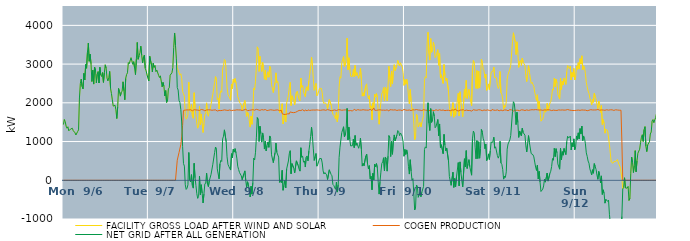
| Category | FACILITY GROSS LOAD AFTER WIND AND SOLAR | COGEN PRODUCTION | NET GRID AFTER ALL GENERATION |
|---|---|---|---|
|  Mon  9/6 | 1440 | 0 | 1440 |
|  Mon  9/6 | 1570 | 0 | 1570 |
|  Mon  9/6 | 1513 | 0 | 1513 |
|  Mon  9/6 | 1398 | 0 | 1398 |
|  Mon  9/6 | 1344 | 0 | 1344 |
|  Mon  9/6 | 1382 | 0 | 1382 |
|  Mon  9/6 | 1277 | 0 | 1277 |
|  Mon  9/6 | 1284 | 0 | 1284 |
|  Mon  9/6 | 1323 | 0 | 1323 |
|  Mon  9/6 | 1324 | 0 | 1324 |
|  Mon  9/6 | 1343 | 0 | 1343 |
|  Mon  9/6 | 1282 | 0 | 1282 |
|  Mon  9/6 | 1268 | 0 | 1268 |
|  Mon  9/6 | 1226 | 0 | 1226 |
|  Mon  9/6 | 1169 | 0 | 1169 |
|  Mon  9/6 | 1148 | 0 | 1148 |
|  Mon  9/6 | 1260 | 0 | 1260 |
|  Mon  9/6 | 1301 | 0 | 1301 |
|  Mon  9/6 | 2125 | 0 | 2125 |
|  Mon  9/6 | 2493 | 0 | 2493 |
|  Mon  9/6 | 2610 | 0 | 2610 |
|  Mon  9/6 | 2418 | 0 | 2418 |
|  Mon  9/6 | 2359 | 0 | 2359 |
|  Mon  9/6 | 2760 | 0 | 2760 |
|  Mon  9/6 | 2590 | 0 | 2590 |
|  Mon  9/6 | 2988 | 0 | 2988 |
|  Mon  9/6 | 2892 | 0 | 2892 |
|  Mon  9/6 | 3305 | 0 | 3305 |
|  Mon  9/6 | 3542 | 0 | 3542 |
|  Mon  9/6 | 3073 | 0 | 3073 |
|  Mon  9/6 | 3255 | 0 | 3255 |
|  Mon  9/6 | 3012 | 0 | 3012 |
|  Mon  9/6 | 2550 | 0 | 2550 |
|  Mon  9/6 | 2844 | 0 | 2844 |
|  Mon  9/6 | 2484 | 0 | 2484 |
|  Mon  9/6 | 2923 | 0 | 2923 |
|  Mon  9/6 | 2847 | 0 | 2847 |
|  Mon  9/6 | 2517 | 0 | 2517 |
|  Mon  9/6 | 2739 | 0 | 2739 |
|  Mon  9/6 | 2807 | 0 | 2807 |
|  Mon  9/6 | 2512 | 0 | 2512 |
|  Mon  9/6 | 2918 | 0 | 2918 |
|  Mon  9/6 | 2721 | 0 | 2721 |
|  Mon  9/6 | 2679 | 0 | 2679 |
|  Mon  9/6 | 2782 | 0 | 2782 |
|  Mon  9/6 | 2528 | 0 | 2528 |
|  Mon  9/6 | 2772 | 0 | 2772 |
|  Mon  9/6 | 2981 | 0 | 2981 |
|  Mon  9/6 | 2894 | 0 | 2894 |
|  Mon  9/6 | 2640 | 0 | 2640 |
|  Mon  9/6 | 2564 | 0 | 2564 |
|  Mon  9/6 | 2644 | 0 | 2644 |
|  Mon  9/6 | 2810 | 0 | 2810 |
|  Mon  9/6 | 2367 | 0 | 2367 |
|  Mon  9/6 | 2238 | 0 | 2238 |
|  Mon  9/6 | 2075 | 0 | 2075 |
|  Mon  9/6 | 1915 | 0 | 1915 |
|  Mon  9/6 | 1892 | 0 | 1892 |
|  Mon  9/6 | 1938 | 0 | 1938 |
|  Mon  9/6 | 1819 | 0 | 1819 |
|  Mon  9/6 | 1594 | 0 | 1594 |
|  Mon  9/6 | 1897 | 0 | 1897 |
|  Mon  9/6 | 2371 | 0 | 2371 |
|  Mon  9/6 | 2284 | 0 | 2284 |
|  Mon  9/6 | 2173 | 0 | 2173 |
|  Mon  9/6 | 2274 | 0 | 2274 |
|  Mon  9/6 | 2301 | 0 | 2301 |
|  Mon  9/6 | 2542 | 0 | 2542 |
|  Mon  9/6 | 2311 | 0 | 2311 |
|  Mon  9/6 | 2079 | 0 | 2079 |
|  Mon  9/6 | 2630 | 0 | 2630 |
|  Mon  9/6 | 2729 | 0 | 2729 |
|  Mon  9/6 | 2774 | 0 | 2774 |
|  Mon  9/6 | 3039 | 0 | 3039 |
|  Mon  9/6 | 3012 | 0 | 3012 |
|  Mon  9/6 | 3008 | 0 | 3008 |
|  Mon  9/6 | 3166 | 0 | 3166 |
|  Mon  9/6 | 3168 | 0 | 3168 |
|  Mon  9/6 | 2994 | 0 | 2994 |
|  Mon  9/6 | 3063 | 0 | 3063 |
|  Mon  9/6 | 2901 | 0 | 2901 |
|  Mon  9/6 | 2729 | 0 | 2729 |
|  Mon  9/6 | 3128 | 0 | 3128 |
|  Mon  9/6 | 3559 | 0 | 3559 |
|  Mon  9/6 | 3124 | 0 | 3124 |
|  Mon  9/6 | 3210 | 0 | 3210 |
|  Mon  9/6 | 3291 | 0 | 3291 |
|  Mon  9/6 | 3463 | 0 | 3463 |
|  Mon  9/6 | 3228 | 0 | 3228 |
|  Mon  9/6 | 3028 | 0 | 3028 |
|  Mon  9/6 | 3182 | 0 | 3182 |
|  Mon  9/6 | 3233 | 0 | 3233 |
|  Mon  9/6 | 2890 | 0 | 2890 |
|  Mon  9/6 | 2823 | 0 | 2823 |
|  Mon  9/6 | 2720 | 0 | 2720 |
|  Mon  9/6 | 2702 | 0 | 2702 |
|  Tue  9/7 | 2564 | 0 | 2564 |
|  Tue  9/7 | 3204 | 0 | 3204 |
|  Tue  9/7 | 3201 | 0 | 3201 |
|  Tue  9/7 | 2976 | 0 | 2976 |
|  Tue  9/7 | 2799 | 0 | 2799 |
|  Tue  9/7 | 3021 | 0 | 3021 |
|  Tue  9/7 | 2916 | 0 | 2916 |
|  Tue  9/7 | 2964 | 0 | 2964 |
|  Tue  9/7 | 2805 | 0 | 2805 |
|  Tue  9/7 | 2845 | 0 | 2845 |
|  Tue  9/7 | 2868 | 0 | 2868 |
|  Tue  9/7 | 2711 | 0 | 2711 |
|  Tue  9/7 | 2653 | 0 | 2653 |
|  Tue  9/7 | 2697 | 0 | 2697 |
|  Tue  9/7 | 2678 | 0 | 2678 |
|  Tue  9/7 | 2414 | 0 | 2414 |
|  Tue  9/7 | 2527 | 0 | 2527 |
|  Tue  9/7 | 2426 | 0 | 2426 |
|  Tue  9/7 | 2176 | 0 | 2176 |
|  Tue  9/7 | 2316 | 0 | 2316 |
|  Tue  9/7 | 2009 | 0 | 2009 |
|  Tue  9/7 | 2038 | 0 | 2038 |
|  Tue  9/7 | 2361 | 0 | 2361 |
|  Tue  9/7 | 2387 | 0 | 2387 |
|  Tue  9/7 | 2712 | 0 | 2712 |
|  Tue  9/7 | 2733 | 0 | 2733 |
|  Tue  9/7 | 2776 | 0 | 2776 |
|  Tue  9/7 | 2906 | 0 | 2906 |
|  Tue  9/7 | 3433 | 0 | 3433 |
|  Tue  9/7 | 3803 | 0 | 3803 |
|  Tue  9/7 | 3480 | 0 | 3480 |
|  Tue  9/7 | 3134 | 0 | 3134 |
|  Tue  9/7 | 2912 | 518 | 2394 |
|  Tue  9/7 | 2839 | 510 | 2329 |
|  Tue  9/7 | 2776 | 718 | 2058 |
|  Tue  9/7 | 2716 | 709 | 2007 |
|  Tue  9/7 | 2751 | 921 | 1830 |
|  Tue  9/7 | 2625 | 1120 | 1505 |
|  Tue  9/7 | 2293 | 1417 | 876 |
|  Tue  9/7 | 2235 | 1804 | 431 |
|  Tue  9/7 | 2169 | 1803 | 366 |
|  Tue  9/7 | 1695 | 1812 | -117 |
|  Tue  9/7 | 1578 | 1814 | -236 |
|  Tue  9/7 | 1613 | 1817 | -204 |
|  Tue  9/7 | 1697 | 1814 | -117 |
|  Tue  9/7 | 2532 | 1815 | 717 |
|  Tue  9/7 | 1827 | 1818 | 9 |
|  Tue  9/7 | 1777 | 1821 | -44 |
|  Tue  9/7 | 1957 | 1811 | 146 |
|  Tue  9/7 | 1659 | 1795 | -136 |
|  Tue  9/7 | 1600 | 1803 | -203 |
|  Tue  9/7 | 2261 | 1823 | 438 |
|  Tue  9/7 | 1878 | 1814 | 64 |
|  Tue  9/7 | 1681 | 1816 | -135 |
|  Tue  9/7 | 1465 | 1812 | -347 |
|  Tue  9/7 | 1344 | 1812 | -468 |
|  Tue  9/7 | 1399 | 1814 | -415 |
|  Tue  9/7 | 1912 | 1803 | 109 |
|  Tue  9/7 | 1440 | 1812 | -372 |
|  Tue  9/7 | 1712 | 1827 | -115 |
|  Tue  9/7 | 1472 | 1804 | -332 |
|  Tue  9/7 | 1234 | 1819 | -585 |
|  Tue  9/7 | 1461 | 1817 | -356 |
|  Tue  9/7 | 1697 | 1794 | -97 |
|  Tue  9/7 | 1748 | 1819 | -71 |
|  Tue  9/7 | 1999 | 1815 | 184 |
|  Tue  9/7 | 1708 | 1812 | -104 |
|  Tue  9/7 | 1653 | 1819 | -166 |
|  Tue  9/7 | 1794 | 1809 | -15 |
|  Tue  9/7 | 1825 | 1817 | 8 |
|  Tue  9/7 | 1958 | 1806 | 152 |
|  Tue  9/7 | 1936 | 1808 | 128 |
|  Tue  9/7 | 2223 | 1809 | 414 |
|  Tue  9/7 | 2246 | 1814 | 432 |
|  Tue  9/7 | 2529 | 1815 | 714 |
|  Tue  9/7 | 2676 | 1817 | 859 |
|  Tue  9/7 | 2597 | 1807 | 790 |
|  Tue  9/7 | 2083 | 1788 | 295 |
|  Tue  9/7 | 2126 | 1808 | 318 |
|  Tue  9/7 | 1839 | 1802 | 37 |
|  Tue  9/7 | 2217 | 1795 | 422 |
|  Tue  9/7 | 2312 | 1799 | 513 |
|  Tue  9/7 | 2271 | 1786 | 485 |
|  Tue  9/7 | 2873 | 1806 | 1067 |
|  Tue  9/7 | 2959 | 1821 | 1138 |
|  Tue  9/7 | 3120 | 1818 | 1302 |
|  Tue  9/7 | 3094 | 1807 | 1287 |
|  Tue  9/7 | 2805 | 1809 | 996 |
|  Tue  9/7 | 2408 | 1803 | 605 |
|  Tue  9/7 | 2216 | 1803 | 413 |
|  Tue  9/7 | 2172 | 1815 | 357 |
|  Tue  9/7 | 2149 | 1815 | 334 |
|  Tue  9/7 | 2067 | 1803 | 264 |
|  Tue  9/7 | 2486 | 1799 | 687 |
|  Tue  9/7 | 2363 | 1787 | 576 |
|  Tue  9/7 | 2609 | 1808 | 801 |
|  Wed  9/8 | 2529 | 1802 | 727 |
|  Wed  9/8 | 2627 | 1809 | 818 |
|  Wed  9/8 | 2517 | 1810 | 707 |
|  Wed  9/8 | 2391 | 1819 | 572 |
|  Wed  9/8 | 2163 | 1799 | 364 |
|  Wed  9/8 | 2093 | 1815 | 278 |
|  Wed  9/8 | 2016 | 1815 | 201 |
|  Wed  9/8 | 2016 | 1815 | 201 |
|  Wed  9/8 | 1940 | 1826 | 114 |
|  Wed  9/8 | 1814 | 1801 | 13 |
|  Wed  9/8 | 1818 | 1803 | 15 |
|  Wed  9/8 | 1991 | 1816 | 175 |
|  Wed  9/8 | 2061 | 1818 | 243 |
|  Wed  9/8 | 1833 | 1832 | 1 |
|  Wed  9/8 | 1649 | 1833 | -184 |
|  Wed  9/8 | 1760 | 1798 | -38 |
|  Wed  9/8 | 1690 | 1805 | -115 |
|  Wed  9/8 | 1689 | 1806 | -117 |
|  Wed  9/8 | 1373 | 1805 | -432 |
|  Wed  9/8 | 1659 | 1813 | -154 |
|  Wed  9/8 | 1445 | 1804 | -359 |
|  Wed  9/8 | 1765 | 1823 | -58 |
|  Wed  9/8 | 2381 | 1813 | 568 |
|  Wed  9/8 | 2334 | 1810 | 524 |
|  Wed  9/8 | 2557 | 1833 | 724 |
|  Wed  9/8 | 2946 | 1832 | 1114 |
|  Wed  9/8 | 3445 | 1827 | 1618 |
|  Wed  9/8 | 3387 | 1818 | 1569 |
|  Wed  9/8 | 2810 | 1809 | 1001 |
|  Wed  9/8 | 3200 | 1805 | 1395 |
|  Wed  9/8 | 3004 | 1802 | 1202 |
|  Wed  9/8 | 2809 | 1824 | 985 |
|  Wed  9/8 | 3044 | 1822 | 1222 |
|  Wed  9/8 | 2915 | 1815 | 1100 |
|  Wed  9/8 | 2609 | 1803 | 806 |
|  Wed  9/8 | 2840 | 1826 | 1014 |
|  Wed  9/8 | 2588 | 1827 | 761 |
|  Wed  9/8 | 2696 | 1800 | 896 |
|  Wed  9/8 | 2801 | 1811 | 990 |
|  Wed  9/8 | 2661 | 1810 | 851 |
|  Wed  9/8 | 2946 | 1802 | 1144 |
|  Wed  9/8 | 2900 | 1820 | 1080 |
|  Wed  9/8 | 2468 | 1810 | 658 |
|  Wed  9/8 | 2476 | 1813 | 663 |
|  Wed  9/8 | 2265 | 1810 | 455 |
|  Wed  9/8 | 2244 | 1806 | 438 |
|  Wed  9/8 | 2526 | 1810 | 716 |
|  Wed  9/8 | 2774 | 1814 | 960 |
|  Wed  9/8 | 2521 | 1802 | 719 |
|  Wed  9/8 | 2554 | 1817 | 737 |
|  Wed  9/8 | 2411 | 1813 | 598 |
|  Wed  9/8 | 1743 | 1797 | -54 |
|  Wed  9/8 | 1822 | 1813 | 9 |
|  Wed  9/8 | 1746 | 1808 | -62 |
|  Wed  9/8 | 1976 | 1719 | 257 |
|  Wed  9/8 | 1457 | 1715 | -258 |
|  Wed  9/8 | 1564 | 1700 | -136 |
|  Wed  9/8 | 1713 | 1716 | -3 |
|  Wed  9/8 | 1507 | 1701 | -194 |
|  Wed  9/8 | 1996 | 1705 | 291 |
|  Wed  9/8 | 2006 | 1716 | 290 |
|  Wed  9/8 | 2196 | 1698 | 498 |
|  Wed  9/8 | 2404 | 1716 | 688 |
|  Wed  9/8 | 2529 | 1765 | 764 |
|  Wed  9/8 | 1931 | 1763 | 168 |
|  Wed  9/8 | 2182 | 1751 | 431 |
|  Wed  9/8 | 2192 | 1764 | 428 |
|  Wed  9/8 | 2058 | 1746 | 312 |
|  Wed  9/8 | 1946 | 1757 | 189 |
|  Wed  9/8 | 1953 | 1755 | 198 |
|  Wed  9/8 | 2273 | 1771 | 502 |
|  Wed  9/8 | 2302 | 1779 | 523 |
|  Wed  9/8 | 2176 | 1798 | 378 |
|  Wed  9/8 | 2092 | 1804 | 288 |
|  Wed  9/8 | 2050 | 1814 | 236 |
|  Wed  9/8 | 2641 | 1801 | 840 |
|  Wed  9/8 | 2398 | 1805 | 593 |
|  Wed  9/8 | 2444 | 1823 | 621 |
|  Wed  9/8 | 2278 | 1812 | 466 |
|  Wed  9/8 | 2286 | 1787 | 499 |
|  Wed  9/8 | 2159 | 1817 | 342 |
|  Wed  9/8 | 2385 | 1792 | 593 |
|  Wed  9/8 | 2420 | 1792 | 628 |
|  Wed  9/8 | 2319 | 1818 | 501 |
|  Wed  9/8 | 2566 | 1812 | 754 |
|  Wed  9/8 | 2732 | 1803 | 929 |
|  Wed  9/8 | 2944 | 1809 | 1135 |
|  Wed  9/8 | 3180 | 1811 | 1369 |
|  Wed  9/8 | 2947 | 1818 | 1129 |
|  Wed  9/8 | 2624 | 1814 | 810 |
|  Wed  9/8 | 2324 | 1812 | 512 |
|  Wed  9/8 | 2424 | 1812 | 612 |
|  Wed  9/8 | 2501 | 1810 | 691 |
|  Wed  9/8 | 2181 | 1817 | 364 |
|  Wed  9/8 | 2214 | 1806 | 408 |
|  Wed  9/8 | 2225 | 1811 | 414 |
|  Thu  9/9 | 2375 | 1815 | 560 |
|  Thu  9/9 | 2370 | 1806 | 564 |
|  Thu  9/9 | 2370 | 1809 | 561 |
|  Thu  9/9 | 2263 | 1815 | 448 |
|  Thu  9/9 | 2040 | 1797 | 243 |
|  Thu  9/9 | 1979 | 1818 | 161 |
|  Thu  9/9 | 2007 | 1807 | 200 |
|  Thu  9/9 | 1995 | 1806 | 189 |
|  Thu  9/9 | 1957 | 1817 | 140 |
|  Thu  9/9 | 1844 | 1825 | 19 |
|  Thu  9/9 | 1839 | 1812 | 27 |
|  Thu  9/9 | 2084 | 1813 | 271 |
|  Thu  9/9 | 2070 | 1818 | 252 |
|  Thu  9/9 | 1944 | 1793 | 151 |
|  Thu  9/9 | 1929 | 1815 | 114 |
|  Thu  9/9 | 1700 | 1806 | -106 |
|  Thu  9/9 | 1686 | 1819 | -133 |
|  Thu  9/9 | 1659 | 1816 | -157 |
|  Thu  9/9 | 1581 | 1815 | -234 |
|  Thu  9/9 | 1754 | 1800 | -46 |
|  Thu  9/9 | 1507 | 1812 | -305 |
|  Thu  9/9 | 1696 | 1820 | -124 |
|  Thu  9/9 | 2392 | 1804 | 588 |
|  Thu  9/9 | 2673 | 1819 | 854 |
|  Thu  9/9 | 2637 | 1802 | 835 |
|  Thu  9/9 | 3039 | 1807 | 1232 |
|  Thu  9/9 | 3019 | 1807 | 1212 |
|  Thu  9/9 | 3196 | 1814 | 1382 |
|  Thu  9/9 | 2935 | 1813 | 1122 |
|  Thu  9/9 | 2976 | 1818 | 1158 |
|  Thu  9/9 | 3152 | 1808 | 1344 |
|  Thu  9/9 | 3671 | 1815 | 1856 |
|  Thu  9/9 | 2854 | 1810 | 1044 |
|  Thu  9/9 | 3164 | 1793 | 1371 |
|  Thu  9/9 | 2872 | 1814 | 1058 |
|  Thu  9/9 | 2687 | 1801 | 886 |
|  Thu  9/9 | 2672 | 1807 | 865 |
|  Thu  9/9 | 2681 | 1787 | 894 |
|  Thu  9/9 | 2861 | 1799 | 1062 |
|  Thu  9/9 | 2677 | 1834 | 843 |
|  Thu  9/9 | 2965 | 1809 | 1156 |
|  Thu  9/9 | 2705 | 1803 | 902 |
|  Thu  9/9 | 2779 | 1819 | 960 |
|  Thu  9/9 | 2788 | 1824 | 964 |
|  Thu  9/9 | 2632 | 1806 | 826 |
|  Thu  9/9 | 2726 | 1813 | 913 |
|  Thu  9/9 | 2897 | 1810 | 1087 |
|  Thu  9/9 | 2621 | 1812 | 809 |
|  Thu  9/9 | 2172 | 1806 | 366 |
|  Thu  9/9 | 2260 | 1822 | 438 |
|  Thu  9/9 | 2174 | 1802 | 372 |
|  Thu  9/9 | 2176 | 1814 | 362 |
|  Thu  9/9 | 2443 | 1819 | 624 |
|  Thu  9/9 | 2490 | 1812 | 678 |
|  Thu  9/9 | 2213 | 1795 | 418 |
|  Thu  9/9 | 2100 | 1810 | 290 |
|  Thu  9/9 | 2184 | 1806 | 378 |
|  Thu  9/9 | 1871 | 1831 | 40 |
|  Thu  9/9 | 1921 | 1820 | 101 |
|  Thu  9/9 | 1556 | 1801 | -245 |
|  Thu  9/9 | 2001 | 1821 | 180 |
|  Thu  9/9 | 1878 | 1868 | 10 |
|  Thu  9/9 | 2224 | 1809 | 415 |
|  Thu  9/9 | 2156 | 1811 | 345 |
|  Thu  9/9 | 2239 | 1806 | 433 |
|  Thu  9/9 | 2132 | 1811 | 321 |
|  Thu  9/9 | 1765 | 1815 | -50 |
|  Thu  9/9 | 1447 | 1804 | -357 |
|  Thu  9/9 | 1788 | 1819 | -31 |
|  Thu  9/9 | 2013 | 1803 | 210 |
|  Thu  9/9 | 2243 | 1811 | 432 |
|  Thu  9/9 | 2278 | 1802 | 476 |
|  Thu  9/9 | 2392 | 1811 | 581 |
|  Thu  9/9 | 2055 | 1810 | 245 |
|  Thu  9/9 | 2408 | 1807 | 601 |
|  Thu  9/9 | 2365 | 1818 | 547 |
|  Thu  9/9 | 2053 | 1818 | 235 |
|  Thu  9/9 | 2419 | 1797 | 622 |
|  Thu  9/9 | 2942 | 1788 | 1154 |
|  Thu  9/9 | 2919 | 1822 | 1097 |
|  Thu  9/9 | 2422 | 1810 | 612 |
|  Thu  9/9 | 2822 | 1819 | 1003 |
|  Thu  9/9 | 2485 | 1814 | 671 |
|  Thu  9/9 | 2839 | 1814 | 1025 |
|  Thu  9/9 | 2985 | 1814 | 1171 |
|  Thu  9/9 | 2834 | 1819 | 1015 |
|  Thu  9/9 | 2811 | 1801 | 1010 |
|  Thu  9/9 | 2970 | 1803 | 1167 |
|  Thu  9/9 | 3094 | 1810 | 1284 |
|  Thu  9/9 | 3070 | 1813 | 1257 |
|  Thu  9/9 | 2952 | 1800 | 1152 |
|  Thu  9/9 | 3034 | 1813 | 1221 |
|  Thu  9/9 | 2977 | 1793 | 1184 |
|  Thu  9/9 | 2925 | 1801 | 1124 |
|  Thu  9/9 | 2781 | 1790 | 991 |
|  Thu  9/9 | 2450 | 1830 | 620 |
|  Fri  9/10 | 2602 | 1806 | 796 |
|  Fri  9/10 | 2479 | 1812 | 667 |
|  Fri  9/10 | 2608 | 1824 | 784 |
|  Fri  9/10 | 2477 | 1808 | 669 |
|  Fri  9/10 | 2170 | 1811 | 359 |
|  Fri  9/10 | 1974 | 1814 | 160 |
|  Fri  9/10 | 2344 | 1814 | 530 |
|  Fri  9/10 | 2030 | 1799 | 231 |
|  Fri  9/10 | 1818 | 1816 | 2 |
|  Fri  9/10 | 1862 | 1819 | 43 |
|  Fri  9/10 | 1467 | 1812 | -345 |
|  Fri  9/10 | 1049 | 1816 | -767 |
|  Fri  9/10 | 1118 | 1808 | -690 |
|  Fri  9/10 | 1704 | 1826 | -122 |
|  Fri  9/10 | 1652 | 1804 | -152 |
|  Fri  9/10 | 1375 | 1814 | -439 |
|  Fri  9/10 | 1431 | 1808 | -377 |
|  Fri  9/10 | 1494 | 1811 | -317 |
|  Fri  9/10 | 1376 | 1802 | -426 |
|  Fri  9/10 | 1490 | 1801 | -311 |
|  Fri  9/10 | 1480 | 1811 | -331 |
|  Fri  9/10 | 1666 | 1823 | -157 |
|  Fri  9/10 | 2597 | 1801 | 796 |
|  Fri  9/10 | 2675 | 1812 | 863 |
|  Fri  9/10 | 2646 | 1814 | 832 |
|  Fri  9/10 | 3544 | 1806 | 1738 |
|  Fri  9/10 | 3821 | 1820 | 2001 |
|  Fri  9/10 | 3271 | 1799 | 1472 |
|  Fri  9/10 | 3104 | 1819 | 1285 |
|  Fri  9/10 | 3660 | 1810 | 1850 |
|  Fri  9/10 | 3305 | 1810 | 1495 |
|  Fri  9/10 | 3365 | 1807 | 1558 |
|  Fri  9/10 | 3563 | 1792 | 1771 |
|  Fri  9/10 | 3456 | 1798 | 1658 |
|  Fri  9/10 | 3167 | 1810 | 1357 |
|  Fri  9/10 | 3209 | 1821 | 1388 |
|  Fri  9/10 | 3218 | 1820 | 1398 |
|  Fri  9/10 | 3373 | 1803 | 1570 |
|  Fri  9/10 | 2969 | 1820 | 1149 |
|  Fri  9/10 | 3274 | 1820 | 1454 |
|  Fri  9/10 | 2647 | 1801 | 846 |
|  Fri  9/10 | 2724 | 1806 | 918 |
|  Fri  9/10 | 2739 | 1814 | 925 |
|  Fri  9/10 | 2501 | 1814 | 687 |
|  Fri  9/10 | 2989 | 1804 | 1185 |
|  Fri  9/10 | 2705 | 1798 | 907 |
|  Fri  9/10 | 2574 | 1816 | 758 |
|  Fri  9/10 | 2640 | 1806 | 834 |
|  Fri  9/10 | 2628 | 1804 | 824 |
|  Fri  9/10 | 2312 | 1807 | 505 |
|  Fri  9/10 | 1899 | 1801 | 98 |
|  Fri  9/10 | 1890 | 1795 | 95 |
|  Fri  9/10 | 1655 | 1785 | -130 |
|  Fri  9/10 | 1679 | 1816 | -137 |
|  Fri  9/10 | 2003 | 1796 | 207 |
|  Fri  9/10 | 1627 | 1812 | -185 |
|  Fri  9/10 | 1848 | 1803 | 45 |
|  Fri  9/10 | 1673 | 1839 | -166 |
|  Fri  9/10 | 1889 | 1804 | 85 |
|  Fri  9/10 | 1888 | 1828 | 60 |
|  Fri  9/10 | 2246 | 1789 | 457 |
|  Fri  9/10 | 1660 | 1804 | -144 |
|  Fri  9/10 | 2287 | 1812 | 475 |
|  Fri  9/10 | 2021 | 1817 | 204 |
|  Fri  9/10 | 1811 | 1815 | -4 |
|  Fri  9/10 | 1640 | 1811 | -171 |
|  Fri  9/10 | 1664 | 1822 | -158 |
|  Fri  9/10 | 2352 | 1796 | 556 |
|  Fri  9/10 | 2144 | 1800 | 344 |
|  Fri  9/10 | 2579 | 1813 | 766 |
|  Fri  9/10 | 2112 | 1807 | 305 |
|  Fri  9/10 | 2227 | 1802 | 425 |
|  Fri  9/10 | 2346 | 1813 | 533 |
|  Fri  9/10 | 2151 | 1803 | 348 |
|  Fri  9/10 | 2165 | 1820 | 345 |
|  Fri  9/10 | 1918 | 1787 | 131 |
|  Fri  9/10 | 2892 | 1811 | 1081 |
|  Fri  9/10 | 3093 | 1822 | 1271 |
|  Fri  9/10 | 3028 | 1809 | 1219 |
|  Fri  9/10 | 2666 | 1811 | 855 |
|  Fri  9/10 | 2372 | 1819 | 553 |
|  Fri  9/10 | 2831 | 1808 | 1023 |
|  Fri  9/10 | 2370 | 1809 | 561 |
|  Fri  9/10 | 2817 | 1822 | 995 |
|  Fri  9/10 | 2385 | 1815 | 570 |
|  Fri  9/10 | 2632 | 1816 | 816 |
|  Fri  9/10 | 3125 | 1812 | 1313 |
|  Fri  9/10 | 3043 | 1797 | 1246 |
|  Fri  9/10 | 2869 | 1783 | 1086 |
|  Fri  9/10 | 2827 | 1815 | 1012 |
|  Fri  9/10 | 2640 | 1825 | 815 |
|  Fri  9/10 | 2738 | 1806 | 932 |
|  Fri  9/10 | 2322 | 1812 | 510 |
|  Fri  9/10 | 2390 | 1817 | 573 |
|  Fri  9/10 | 2488 | 1806 | 682 |
|  Fri  9/10 | 2341 | 1804 | 537 |
|  Sat  9/11 | 2582 | 1822 | 760 |
|  Sat  9/11 | 2789 | 1793 | 996 |
|  Sat  9/11 | 2796 | 1828 | 968 |
|  Sat  9/11 | 2822 | 1811 | 1011 |
|  Sat  9/11 | 2921 | 1810 | 1111 |
|  Sat  9/11 | 2654 | 1825 | 829 |
|  Sat  9/11 | 2670 | 1806 | 864 |
|  Sat  9/11 | 2643 | 1800 | 843 |
|  Sat  9/11 | 2457 | 1818 | 639 |
|  Sat  9/11 | 2371 | 1800 | 571 |
|  Sat  9/11 | 2427 | 1794 | 633 |
|  Sat  9/11 | 2809 | 1803 | 1006 |
|  Sat  9/11 | 2260 | 1813 | 447 |
|  Sat  9/11 | 2223 | 1812 | 411 |
|  Sat  9/11 | 2078 | 1797 | 281 |
|  Sat  9/11 | 1833 | 1803 | 30 |
|  Sat  9/11 | 1926 | 1816 | 110 |
|  Sat  9/11 | 1889 | 1816 | 73 |
|  Sat  9/11 | 2032 | 1814 | 218 |
|  Sat  9/11 | 2613 | 1809 | 804 |
|  Sat  9/11 | 2732 | 1795 | 937 |
|  Sat  9/11 | 2723 | 1795 | 928 |
|  Sat  9/11 | 2866 | 1824 | 1042 |
|  Sat  9/11 | 2966 | 1811 | 1155 |
|  Sat  9/11 | 2958 | 1816 | 1142 |
|  Sat  9/11 | 3580 | 1805 | 1775 |
|  Sat  9/11 | 3808 | 1780 | 2028 |
|  Sat  9/11 | 3797 | 1810 | 1987 |
|  Sat  9/11 | 3572 | 1807 | 1765 |
|  Sat  9/11 | 3245 | 1808 | 1437 |
|  Sat  9/11 | 3576 | 1820 | 1756 |
|  Sat  9/11 | 3299 | 1809 | 1490 |
|  Sat  9/11 | 2915 | 1808 | 1107 |
|  Sat  9/11 | 3070 | 1797 | 1273 |
|  Sat  9/11 | 3102 | 1814 | 1288 |
|  Sat  9/11 | 2965 | 1819 | 1146 |
|  Sat  9/11 | 3155 | 1811 | 1344 |
|  Sat  9/11 | 3045 | 1815 | 1230 |
|  Sat  9/11 | 3034 | 1818 | 1216 |
|  Sat  9/11 | 2967 | 1801 | 1166 |
|  Sat  9/11 | 2699 | 1812 | 887 |
|  Sat  9/11 | 2549 | 1817 | 732 |
|  Sat  9/11 | 2760 | 1812 | 948 |
|  Sat  9/11 | 2959 | 1805 | 1154 |
|  Sat  9/11 | 2791 | 1819 | 972 |
|  Sat  9/11 | 2785 | 1815 | 970 |
|  Sat  9/11 | 2502 | 1812 | 690 |
|  Sat  9/11 | 2531 | 1822 | 709 |
|  Sat  9/11 | 2474 | 1814 | 660 |
|  Sat  9/11 | 2422 | 1818 | 604 |
|  Sat  9/11 | 2277 | 1807 | 470 |
|  Sat  9/11 | 2166 | 1825 | 341 |
|  Sat  9/11 | 2060 | 1806 | 254 |
|  Sat  9/11 | 2207 | 1819 | 388 |
|  Sat  9/11 | 1843 | 1809 | 34 |
|  Sat  9/11 | 2043 | 1813 | 230 |
|  Sat  9/11 | 1758 | 1808 | -50 |
|  Sat  9/11 | 1526 | 1816 | -290 |
|  Sat  9/11 | 1533 | 1809 | -276 |
|  Sat  9/11 | 1578 | 1807 | -229 |
|  Sat  9/11 | 1652 | 1799 | -147 |
|  Sat  9/11 | 1845 | 1816 | 29 |
|  Sat  9/11 | 1759 | 1807 | -48 |
|  Sat  9/11 | 1786 | 1814 | -28 |
|  Sat  9/11 | 1988 | 1801 | 187 |
|  Sat  9/11 | 1799 | 1821 | -22 |
|  Sat  9/11 | 1804 | 1807 | -3 |
|  Sat  9/11 | 1993 | 1816 | 177 |
|  Sat  9/11 | 2030 | 1797 | 233 |
|  Sat  9/11 | 2155 | 1799 | 356 |
|  Sat  9/11 | 2356 | 1794 | 562 |
|  Sat  9/11 | 2327 | 1811 | 516 |
|  Sat  9/11 | 2640 | 1815 | 825 |
|  Sat  9/11 | 2416 | 1805 | 611 |
|  Sat  9/11 | 2614 | 1798 | 816 |
|  Sat  9/11 | 2514 | 1803 | 711 |
|  Sat  9/11 | 2226 | 1804 | 422 |
|  Sat  9/11 | 2215 | 1817 | 398 |
|  Sat  9/11 | 2096 | 1810 | 286 |
|  Sat  9/11 | 2640 | 1812 | 828 |
|  Sat  9/11 | 2343 | 1814 | 529 |
|  Sat  9/11 | 2556 | 1816 | 740 |
|  Sat  9/11 | 2461 | 1813 | 648 |
|  Sat  9/11 | 2632 | 1811 | 821 |
|  Sat  9/11 | 2548 | 1821 | 727 |
|  Sat  9/11 | 2475 | 1813 | 662 |
|  Sat  9/11 | 2800 | 1808 | 992 |
|  Sat  9/11 | 2963 | 1827 | 1136 |
|  Sat  9/11 | 2919 | 1830 | 1089 |
|  Sat  9/11 | 2881 | 1813 | 1068 |
|  Sat  9/11 | 2945 | 1804 | 1141 |
|  Sat  9/11 | 2589 | 1806 | 783 |
|  Sat  9/11 | 2783 | 1815 | 968 |
|  Sat  9/11 | 2665 | 1801 | 864 |
|  Sat  9/11 | 2887 | 1818 | 1069 |
|  Sat  9/11 | 2589 | 1801 | 788 |
|  Sun  9/12 | 2661 | 1799 | 862 |
|  Sun  9/12 | 2951 | 1807 | 1144 |
|  Sun  9/12 | 2863 | 1809 | 1054 |
|  Sun  9/12 | 3037 | 1812 | 1225 |
|  Sun  9/12 | 2872 | 1806 | 1066 |
|  Sun  9/12 | 3140 | 1805 | 1335 |
|  Sun  9/12 | 3001 | 1802 | 1199 |
|  Sun  9/12 | 3214 | 1816 | 1398 |
|  Sun  9/12 | 2851 | 1827 | 1024 |
|  Sun  9/12 | 2957 | 1812 | 1145 |
|  Sun  9/12 | 2919 | 1833 | 1086 |
|  Sun  9/12 | 2752 | 1811 | 941 |
|  Sun  9/12 | 2530 | 1822 | 708 |
|  Sun  9/12 | 2413 | 1796 | 617 |
|  Sun  9/12 | 2305 | 1808 | 497 |
|  Sun  9/12 | 2248 | 1808 | 440 |
|  Sun  9/12 | 2124 | 1830 | 294 |
|  Sun  9/12 | 2041 | 1823 | 218 |
|  Sun  9/12 | 1943 | 1804 | 139 |
|  Sun  9/12 | 2087 | 1815 | 272 |
|  Sun  9/12 | 2013 | 1831 | 182 |
|  Sun  9/12 | 2245 | 1815 | 430 |
|  Sun  9/12 | 2162 | 1807 | 355 |
|  Sun  9/12 | 2094 | 1816 | 278 |
|  Sun  9/12 | 1950 | 1814 | 136 |
|  Sun  9/12 | 1853 | 1828 | 25 |
|  Sun  9/12 | 2045 | 1817 | 228 |
|  Sun  9/12 | 1944 | 1809 | 135 |
|  Sun  9/12 | 1755 | 1823 | -68 |
|  Sun  9/12 | 1929 | 1816 | 113 |
|  Sun  9/12 | 1440 | 1806 | -366 |
|  Sun  9/12 | 1567 | 1813 | -246 |
|  Sun  9/12 | 1469 | 1810 | -341 |
|  Sun  9/12 | 1216 | 1807 | -591 |
|  Sun  9/12 | 1320 | 1812 | -492 |
|  Sun  9/12 | 1345 | 1821 | -476 |
|  Sun  9/12 | 1273 | 1818 | -545 |
|  Sun  9/12 | 1297 | 1810 | -513 |
|  Sun  9/12 | 923 | 1801 | -878 |
|  Sun  9/12 | 921 | 1819 | -898 |
|  Sun  9/12 | 473 | 1812 | -1339 |
|  Sun  9/12 | 489 | 1819 | -1330 |
|  Sun  9/12 | 440 | 1817 | -1377 |
|  Sun  9/12 | 484 | 1804 | -1320 |
|  Sun  9/12 | 501 | 1814 | -1313 |
|  Sun  9/12 | 485 | 1820 | -1335 |
|  Sun  9/12 | 466 | 1805 | -1339 |
|  Sun  9/12 | 536 | 1814 | -1278 |
|  Sun  9/12 | 450 | 1810 | -1360 |
|  Sun  9/12 | 433 | 1809 | -1376 |
|  Sun  9/12 | 352 | 1819 | -1467 |
|  Sun  9/12 | 216 | 1808 | -1592 |
|  Sun  9/12 | 53 | 987 | -934 |
|  Sun  9/12 | -223 | 0 | -223 |
|  Sun  9/12 | -186 | 0 | -186 |
|  Sun  9/12 | 65 | 0 | 65 |
|  Sun  9/12 | -199 | 0 | -199 |
|  Sun  9/12 | -188 | 0 | -188 |
|  Sun  9/12 | -203 | 0 | -203 |
|  Sun  9/12 | -158 | 0 | -158 |
|  Sun  9/12 | -521 | 0 | -521 |
|  Sun  9/12 | -464 | 0 | -464 |
|  Sun  9/12 | 182 | 0 | 182 |
|  Sun  9/12 | 598 | 0 | 598 |
|  Sun  9/12 | 458 | 0 | 458 |
|  Sun  9/12 | 200 | 0 | 200 |
|  Sun  9/12 | 384 | 0 | 384 |
|  Sun  9/12 | 765 | 0 | 765 |
|  Sun  9/12 | 219 | 0 | 219 |
|  Sun  9/12 | 502 | 0 | 502 |
|  Sun  9/12 | 698 | 0 | 698 |
|  Sun  9/12 | 700 | 0 | 700 |
|  Sun  9/12 | 802 | 0 | 802 |
|  Sun  9/12 | 969 | 0 | 969 |
|  Sun  9/12 | 1113 | 0 | 1113 |
|  Sun  9/12 | 1175 | 0 | 1175 |
|  Sun  9/12 | 1005 | 0 | 1005 |
|  Sun  9/12 | 1306 | 0 | 1306 |
|  Sun  9/12 | 1385 | 0 | 1385 |
|  Sun  9/12 | 878 | 0 | 878 |
|  Sun  9/12 | 741 | 0 | 741 |
|  Sun  9/12 | 912 | 0 | 912 |
|  Sun  9/12 | 927 | 0 | 927 |
|  Sun  9/12 | 994 | 0 | 994 |
|  Sun  9/12 | 1195 | 0 | 1195 |
|  Sun  9/12 | 1247 | 0 | 1247 |
|  Sun  9/12 | 1531 | 0 | 1531 |
|  Sun  9/12 | 1567 | 0 | 1567 |
|  Sun  9/12 | 1486 | 0 | 1486 |
|  Sun  9/12 | 1563 | 0 | 1563 |
|  Sun  9/12 | 1616 | 0 | 1616 |
|  Sun  9/12 | 1727 | 0 | 1727 |